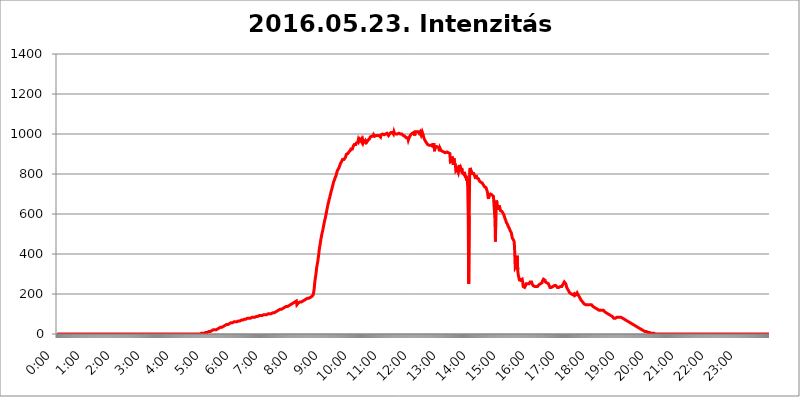
| Category | 2016.05.23. Intenzitás [W/m^2] |
|---|---|
| 0.0 | 0 |
| 0.0006944444444444445 | 0 |
| 0.001388888888888889 | 0 |
| 0.0020833333333333333 | 0 |
| 0.002777777777777778 | 0 |
| 0.003472222222222222 | 0 |
| 0.004166666666666667 | 0 |
| 0.004861111111111111 | 0 |
| 0.005555555555555556 | 0 |
| 0.0062499999999999995 | 0 |
| 0.006944444444444444 | 0 |
| 0.007638888888888889 | 0 |
| 0.008333333333333333 | 0 |
| 0.009027777777777779 | 0 |
| 0.009722222222222222 | 0 |
| 0.010416666666666666 | 0 |
| 0.011111111111111112 | 0 |
| 0.011805555555555555 | 0 |
| 0.012499999999999999 | 0 |
| 0.013194444444444444 | 0 |
| 0.013888888888888888 | 0 |
| 0.014583333333333332 | 0 |
| 0.015277777777777777 | 0 |
| 0.015972222222222224 | 0 |
| 0.016666666666666666 | 0 |
| 0.017361111111111112 | 0 |
| 0.018055555555555557 | 0 |
| 0.01875 | 0 |
| 0.019444444444444445 | 0 |
| 0.02013888888888889 | 0 |
| 0.020833333333333332 | 0 |
| 0.02152777777777778 | 0 |
| 0.022222222222222223 | 0 |
| 0.02291666666666667 | 0 |
| 0.02361111111111111 | 0 |
| 0.024305555555555556 | 0 |
| 0.024999999999999998 | 0 |
| 0.025694444444444447 | 0 |
| 0.02638888888888889 | 0 |
| 0.027083333333333334 | 0 |
| 0.027777777777777776 | 0 |
| 0.02847222222222222 | 0 |
| 0.029166666666666664 | 0 |
| 0.029861111111111113 | 0 |
| 0.030555555555555555 | 0 |
| 0.03125 | 0 |
| 0.03194444444444445 | 0 |
| 0.03263888888888889 | 0 |
| 0.03333333333333333 | 0 |
| 0.034027777777777775 | 0 |
| 0.034722222222222224 | 0 |
| 0.035416666666666666 | 0 |
| 0.036111111111111115 | 0 |
| 0.03680555555555556 | 0 |
| 0.0375 | 0 |
| 0.03819444444444444 | 0 |
| 0.03888888888888889 | 0 |
| 0.03958333333333333 | 0 |
| 0.04027777777777778 | 0 |
| 0.04097222222222222 | 0 |
| 0.041666666666666664 | 0 |
| 0.042361111111111106 | 0 |
| 0.04305555555555556 | 0 |
| 0.043750000000000004 | 0 |
| 0.044444444444444446 | 0 |
| 0.04513888888888889 | 0 |
| 0.04583333333333334 | 0 |
| 0.04652777777777778 | 0 |
| 0.04722222222222222 | 0 |
| 0.04791666666666666 | 0 |
| 0.04861111111111111 | 0 |
| 0.049305555555555554 | 0 |
| 0.049999999999999996 | 0 |
| 0.05069444444444445 | 0 |
| 0.051388888888888894 | 0 |
| 0.052083333333333336 | 0 |
| 0.05277777777777778 | 0 |
| 0.05347222222222222 | 0 |
| 0.05416666666666667 | 0 |
| 0.05486111111111111 | 0 |
| 0.05555555555555555 | 0 |
| 0.05625 | 0 |
| 0.05694444444444444 | 0 |
| 0.057638888888888885 | 0 |
| 0.05833333333333333 | 0 |
| 0.05902777777777778 | 0 |
| 0.059722222222222225 | 0 |
| 0.06041666666666667 | 0 |
| 0.061111111111111116 | 0 |
| 0.06180555555555556 | 0 |
| 0.0625 | 0 |
| 0.06319444444444444 | 0 |
| 0.06388888888888888 | 0 |
| 0.06458333333333334 | 0 |
| 0.06527777777777778 | 0 |
| 0.06597222222222222 | 0 |
| 0.06666666666666667 | 0 |
| 0.06736111111111111 | 0 |
| 0.06805555555555555 | 0 |
| 0.06874999999999999 | 0 |
| 0.06944444444444443 | 0 |
| 0.07013888888888889 | 0 |
| 0.07083333333333333 | 0 |
| 0.07152777777777779 | 0 |
| 0.07222222222222223 | 0 |
| 0.07291666666666667 | 0 |
| 0.07361111111111111 | 0 |
| 0.07430555555555556 | 0 |
| 0.075 | 0 |
| 0.07569444444444444 | 0 |
| 0.0763888888888889 | 0 |
| 0.07708333333333334 | 0 |
| 0.07777777777777778 | 0 |
| 0.07847222222222222 | 0 |
| 0.07916666666666666 | 0 |
| 0.0798611111111111 | 0 |
| 0.08055555555555556 | 0 |
| 0.08125 | 0 |
| 0.08194444444444444 | 0 |
| 0.08263888888888889 | 0 |
| 0.08333333333333333 | 0 |
| 0.08402777777777777 | 0 |
| 0.08472222222222221 | 0 |
| 0.08541666666666665 | 0 |
| 0.08611111111111112 | 0 |
| 0.08680555555555557 | 0 |
| 0.08750000000000001 | 0 |
| 0.08819444444444445 | 0 |
| 0.08888888888888889 | 0 |
| 0.08958333333333333 | 0 |
| 0.09027777777777778 | 0 |
| 0.09097222222222222 | 0 |
| 0.09166666666666667 | 0 |
| 0.09236111111111112 | 0 |
| 0.09305555555555556 | 0 |
| 0.09375 | 0 |
| 0.09444444444444444 | 0 |
| 0.09513888888888888 | 0 |
| 0.09583333333333333 | 0 |
| 0.09652777777777777 | 0 |
| 0.09722222222222222 | 0 |
| 0.09791666666666667 | 0 |
| 0.09861111111111111 | 0 |
| 0.09930555555555555 | 0 |
| 0.09999999999999999 | 0 |
| 0.10069444444444443 | 0 |
| 0.1013888888888889 | 0 |
| 0.10208333333333335 | 0 |
| 0.10277777777777779 | 0 |
| 0.10347222222222223 | 0 |
| 0.10416666666666667 | 0 |
| 0.10486111111111111 | 0 |
| 0.10555555555555556 | 0 |
| 0.10625 | 0 |
| 0.10694444444444444 | 0 |
| 0.1076388888888889 | 0 |
| 0.10833333333333334 | 0 |
| 0.10902777777777778 | 0 |
| 0.10972222222222222 | 0 |
| 0.1111111111111111 | 0 |
| 0.11180555555555556 | 0 |
| 0.11180555555555556 | 0 |
| 0.1125 | 0 |
| 0.11319444444444444 | 0 |
| 0.11388888888888889 | 0 |
| 0.11458333333333333 | 0 |
| 0.11527777777777777 | 0 |
| 0.11597222222222221 | 0 |
| 0.11666666666666665 | 0 |
| 0.1173611111111111 | 0 |
| 0.11805555555555557 | 0 |
| 0.11944444444444445 | 0 |
| 0.12013888888888889 | 0 |
| 0.12083333333333333 | 0 |
| 0.12152777777777778 | 0 |
| 0.12222222222222223 | 0 |
| 0.12291666666666667 | 0 |
| 0.12291666666666667 | 0 |
| 0.12361111111111112 | 0 |
| 0.12430555555555556 | 0 |
| 0.125 | 0 |
| 0.12569444444444444 | 0 |
| 0.12638888888888888 | 0 |
| 0.12708333333333333 | 0 |
| 0.16875 | 0 |
| 0.12847222222222224 | 0 |
| 0.12916666666666668 | 0 |
| 0.12986111111111112 | 0 |
| 0.13055555555555556 | 0 |
| 0.13125 | 0 |
| 0.13194444444444445 | 0 |
| 0.1326388888888889 | 0 |
| 0.13333333333333333 | 0 |
| 0.13402777777777777 | 0 |
| 0.13402777777777777 | 0 |
| 0.13472222222222222 | 0 |
| 0.13541666666666666 | 0 |
| 0.1361111111111111 | 0 |
| 0.13749999999999998 | 0 |
| 0.13819444444444443 | 0 |
| 0.1388888888888889 | 0 |
| 0.13958333333333334 | 0 |
| 0.14027777777777778 | 0 |
| 0.14097222222222222 | 0 |
| 0.14166666666666666 | 0 |
| 0.1423611111111111 | 0 |
| 0.14305555555555557 | 0 |
| 0.14375000000000002 | 0 |
| 0.14444444444444446 | 0 |
| 0.1451388888888889 | 0 |
| 0.1451388888888889 | 0 |
| 0.14652777777777778 | 0 |
| 0.14722222222222223 | 0 |
| 0.14791666666666667 | 0 |
| 0.1486111111111111 | 0 |
| 0.14930555555555555 | 0 |
| 0.15 | 0 |
| 0.15069444444444444 | 0 |
| 0.15138888888888888 | 0 |
| 0.15208333333333332 | 0 |
| 0.15277777777777776 | 0 |
| 0.15347222222222223 | 0 |
| 0.15416666666666667 | 0 |
| 0.15486111111111112 | 0 |
| 0.15555555555555556 | 0 |
| 0.15625 | 0 |
| 0.15694444444444444 | 0 |
| 0.15763888888888888 | 0 |
| 0.15833333333333333 | 0 |
| 0.15902777777777777 | 0 |
| 0.15972222222222224 | 0 |
| 0.16041666666666668 | 0 |
| 0.16111111111111112 | 0 |
| 0.16180555555555556 | 0 |
| 0.1625 | 0 |
| 0.16319444444444445 | 0 |
| 0.1638888888888889 | 0 |
| 0.16458333333333333 | 0 |
| 0.16527777777777777 | 0 |
| 0.16597222222222222 | 0 |
| 0.16666666666666666 | 0 |
| 0.1673611111111111 | 0 |
| 0.16805555555555554 | 0 |
| 0.16874999999999998 | 0 |
| 0.16944444444444443 | 0 |
| 0.17013888888888887 | 0 |
| 0.1708333333333333 | 0 |
| 0.17152777777777775 | 0 |
| 0.17222222222222225 | 0 |
| 0.1729166666666667 | 0 |
| 0.17361111111111113 | 0 |
| 0.17430555555555557 | 0 |
| 0.17500000000000002 | 0 |
| 0.17569444444444446 | 0 |
| 0.1763888888888889 | 0 |
| 0.17708333333333334 | 0 |
| 0.17777777777777778 | 0 |
| 0.17847222222222223 | 0 |
| 0.17916666666666667 | 0 |
| 0.1798611111111111 | 0 |
| 0.18055555555555555 | 0 |
| 0.18125 | 0 |
| 0.18194444444444444 | 0 |
| 0.1826388888888889 | 0 |
| 0.18333333333333335 | 0 |
| 0.1840277777777778 | 0 |
| 0.18472222222222223 | 0 |
| 0.18541666666666667 | 0 |
| 0.18611111111111112 | 0 |
| 0.18680555555555556 | 0 |
| 0.1875 | 0 |
| 0.18819444444444444 | 0 |
| 0.18888888888888888 | 0 |
| 0.18958333333333333 | 0 |
| 0.19027777777777777 | 0 |
| 0.1909722222222222 | 0 |
| 0.19166666666666665 | 0 |
| 0.19236111111111112 | 0 |
| 0.19305555555555554 | 0 |
| 0.19375 | 0 |
| 0.19444444444444445 | 0 |
| 0.1951388888888889 | 0 |
| 0.19583333333333333 | 0 |
| 0.19652777777777777 | 0 |
| 0.19722222222222222 | 0 |
| 0.19791666666666666 | 0 |
| 0.1986111111111111 | 0 |
| 0.19930555555555554 | 0 |
| 0.19999999999999998 | 0 |
| 0.20069444444444443 | 0 |
| 0.20138888888888887 | 3.525 |
| 0.2020833333333333 | 3.525 |
| 0.2027777777777778 | 3.525 |
| 0.2034722222222222 | 3.525 |
| 0.2041666666666667 | 3.525 |
| 0.20486111111111113 | 3.525 |
| 0.20555555555555557 | 3.525 |
| 0.20625000000000002 | 3.525 |
| 0.20694444444444446 | 3.525 |
| 0.2076388888888889 | 3.525 |
| 0.20833333333333334 | 7.887 |
| 0.20902777777777778 | 7.887 |
| 0.20972222222222223 | 7.887 |
| 0.21041666666666667 | 7.887 |
| 0.2111111111111111 | 7.887 |
| 0.21180555555555555 | 12.257 |
| 0.2125 | 12.257 |
| 0.21319444444444444 | 12.257 |
| 0.2138888888888889 | 12.257 |
| 0.21458333333333335 | 12.257 |
| 0.2152777777777778 | 12.257 |
| 0.21597222222222223 | 12.257 |
| 0.21666666666666667 | 16.636 |
| 0.21736111111111112 | 16.636 |
| 0.21805555555555556 | 16.636 |
| 0.21875 | 21.024 |
| 0.21944444444444444 | 21.024 |
| 0.22013888888888888 | 21.024 |
| 0.22083333333333333 | 21.024 |
| 0.22152777777777777 | 21.024 |
| 0.2222222222222222 | 21.024 |
| 0.22291666666666665 | 21.024 |
| 0.2236111111111111 | 21.024 |
| 0.22430555555555556 | 21.024 |
| 0.225 | 25.419 |
| 0.22569444444444445 | 25.419 |
| 0.2263888888888889 | 29.823 |
| 0.22708333333333333 | 29.823 |
| 0.22777777777777777 | 29.823 |
| 0.22847222222222222 | 34.234 |
| 0.22916666666666666 | 34.234 |
| 0.2298611111111111 | 34.234 |
| 0.23055555555555554 | 34.234 |
| 0.23124999999999998 | 34.234 |
| 0.23194444444444443 | 38.653 |
| 0.23263888888888887 | 38.653 |
| 0.2333333333333333 | 38.653 |
| 0.2340277777777778 | 38.653 |
| 0.2347222222222222 | 43.079 |
| 0.2354166666666667 | 43.079 |
| 0.23611111111111113 | 43.079 |
| 0.23680555555555557 | 47.511 |
| 0.23750000000000002 | 47.511 |
| 0.23819444444444446 | 47.511 |
| 0.2388888888888889 | 47.511 |
| 0.23958333333333334 | 47.511 |
| 0.24027777777777778 | 47.511 |
| 0.24097222222222223 | 47.511 |
| 0.24166666666666667 | 51.951 |
| 0.2423611111111111 | 51.951 |
| 0.24305555555555555 | 51.951 |
| 0.24375 | 56.398 |
| 0.24444444444444446 | 56.398 |
| 0.24513888888888888 | 56.398 |
| 0.24583333333333335 | 56.398 |
| 0.2465277777777778 | 56.398 |
| 0.24722222222222223 | 56.398 |
| 0.24791666666666667 | 60.85 |
| 0.24861111111111112 | 60.85 |
| 0.24930555555555556 | 60.85 |
| 0.25 | 60.85 |
| 0.25069444444444444 | 60.85 |
| 0.2513888888888889 | 60.85 |
| 0.2520833333333333 | 60.85 |
| 0.25277777777777777 | 65.31 |
| 0.2534722222222222 | 65.31 |
| 0.25416666666666665 | 65.31 |
| 0.2548611111111111 | 65.31 |
| 0.2555555555555556 | 65.31 |
| 0.25625000000000003 | 65.31 |
| 0.2569444444444445 | 69.775 |
| 0.2576388888888889 | 69.775 |
| 0.25833333333333336 | 69.775 |
| 0.2590277777777778 | 69.775 |
| 0.25972222222222224 | 69.775 |
| 0.2604166666666667 | 69.775 |
| 0.2611111111111111 | 74.246 |
| 0.26180555555555557 | 74.246 |
| 0.2625 | 74.246 |
| 0.26319444444444445 | 74.246 |
| 0.2638888888888889 | 74.246 |
| 0.26458333333333334 | 74.246 |
| 0.2652777777777778 | 74.246 |
| 0.2659722222222222 | 74.246 |
| 0.26666666666666666 | 78.722 |
| 0.2673611111111111 | 78.722 |
| 0.26805555555555555 | 78.722 |
| 0.26875 | 78.722 |
| 0.26944444444444443 | 78.722 |
| 0.2701388888888889 | 78.722 |
| 0.2708333333333333 | 78.722 |
| 0.27152777777777776 | 83.205 |
| 0.2722222222222222 | 83.205 |
| 0.27291666666666664 | 83.205 |
| 0.2736111111111111 | 83.205 |
| 0.2743055555555555 | 83.205 |
| 0.27499999999999997 | 83.205 |
| 0.27569444444444446 | 83.205 |
| 0.27638888888888885 | 83.205 |
| 0.27708333333333335 | 83.205 |
| 0.2777777777777778 | 87.692 |
| 0.27847222222222223 | 87.692 |
| 0.2791666666666667 | 87.692 |
| 0.2798611111111111 | 87.692 |
| 0.28055555555555556 | 87.692 |
| 0.28125 | 87.692 |
| 0.28194444444444444 | 92.184 |
| 0.2826388888888889 | 92.184 |
| 0.2833333333333333 | 92.184 |
| 0.28402777777777777 | 92.184 |
| 0.2847222222222222 | 92.184 |
| 0.28541666666666665 | 92.184 |
| 0.28611111111111115 | 92.184 |
| 0.28680555555555554 | 92.184 |
| 0.28750000000000003 | 92.184 |
| 0.2881944444444445 | 92.184 |
| 0.2888888888888889 | 92.184 |
| 0.28958333333333336 | 96.682 |
| 0.2902777777777778 | 96.682 |
| 0.29097222222222224 | 96.682 |
| 0.2916666666666667 | 96.682 |
| 0.2923611111111111 | 96.682 |
| 0.29305555555555557 | 96.682 |
| 0.29375 | 96.682 |
| 0.29444444444444445 | 96.682 |
| 0.2951388888888889 | 96.682 |
| 0.29583333333333334 | 101.184 |
| 0.2965277777777778 | 101.184 |
| 0.2972222222222222 | 101.184 |
| 0.29791666666666666 | 101.184 |
| 0.2986111111111111 | 101.184 |
| 0.29930555555555555 | 101.184 |
| 0.3 | 101.184 |
| 0.30069444444444443 | 101.184 |
| 0.3013888888888889 | 105.69 |
| 0.3020833333333333 | 105.69 |
| 0.30277777777777776 | 105.69 |
| 0.3034722222222222 | 105.69 |
| 0.30416666666666664 | 105.69 |
| 0.3048611111111111 | 105.69 |
| 0.3055555555555555 | 110.201 |
| 0.30624999999999997 | 110.201 |
| 0.3069444444444444 | 110.201 |
| 0.3076388888888889 | 114.716 |
| 0.30833333333333335 | 114.716 |
| 0.3090277777777778 | 114.716 |
| 0.30972222222222223 | 119.235 |
| 0.3104166666666667 | 119.235 |
| 0.3111111111111111 | 119.235 |
| 0.31180555555555556 | 119.235 |
| 0.3125 | 123.758 |
| 0.31319444444444444 | 123.758 |
| 0.3138888888888889 | 123.758 |
| 0.3145833333333333 | 123.758 |
| 0.31527777777777777 | 128.284 |
| 0.3159722222222222 | 128.284 |
| 0.31666666666666665 | 128.284 |
| 0.31736111111111115 | 128.284 |
| 0.31805555555555554 | 132.814 |
| 0.31875000000000003 | 132.814 |
| 0.3194444444444445 | 132.814 |
| 0.3201388888888889 | 137.347 |
| 0.32083333333333336 | 137.347 |
| 0.3215277777777778 | 137.347 |
| 0.32222222222222224 | 137.347 |
| 0.3229166666666667 | 137.347 |
| 0.3236111111111111 | 137.347 |
| 0.32430555555555557 | 141.884 |
| 0.325 | 141.884 |
| 0.32569444444444445 | 146.423 |
| 0.3263888888888889 | 146.423 |
| 0.32708333333333334 | 146.423 |
| 0.3277777777777778 | 150.964 |
| 0.3284722222222222 | 150.964 |
| 0.32916666666666666 | 150.964 |
| 0.3298611111111111 | 150.964 |
| 0.33055555555555555 | 155.509 |
| 0.33125 | 155.509 |
| 0.33194444444444443 | 155.509 |
| 0.3326388888888889 | 160.056 |
| 0.3333333333333333 | 160.056 |
| 0.3340277777777778 | 160.056 |
| 0.3347222222222222 | 164.605 |
| 0.3354166666666667 | 164.605 |
| 0.3361111111111111 | 146.423 |
| 0.3368055555555556 | 150.964 |
| 0.33749999999999997 | 150.964 |
| 0.33819444444444446 | 155.509 |
| 0.33888888888888885 | 155.509 |
| 0.33958333333333335 | 155.509 |
| 0.34027777777777773 | 160.056 |
| 0.34097222222222223 | 160.056 |
| 0.3416666666666666 | 160.056 |
| 0.3423611111111111 | 160.056 |
| 0.3430555555555555 | 164.605 |
| 0.34375 | 164.605 |
| 0.3444444444444445 | 164.605 |
| 0.3451388888888889 | 164.605 |
| 0.3458333333333334 | 169.156 |
| 0.34652777777777777 | 169.156 |
| 0.34722222222222227 | 173.709 |
| 0.34791666666666665 | 173.709 |
| 0.34861111111111115 | 173.709 |
| 0.34930555555555554 | 173.709 |
| 0.35000000000000003 | 173.709 |
| 0.3506944444444444 | 178.264 |
| 0.3513888888888889 | 178.264 |
| 0.3520833333333333 | 178.264 |
| 0.3527777777777778 | 178.264 |
| 0.3534722222222222 | 182.82 |
| 0.3541666666666667 | 182.82 |
| 0.3548611111111111 | 182.82 |
| 0.35555555555555557 | 182.82 |
| 0.35625 | 187.378 |
| 0.35694444444444445 | 187.378 |
| 0.3576388888888889 | 191.937 |
| 0.35833333333333334 | 191.937 |
| 0.3590277777777778 | 196.497 |
| 0.3597222222222222 | 210.182 |
| 0.36041666666666666 | 228.436 |
| 0.3611111111111111 | 255.813 |
| 0.36180555555555555 | 274.047 |
| 0.3625 | 292.259 |
| 0.36319444444444443 | 310.44 |
| 0.3638888888888889 | 333.113 |
| 0.3645833333333333 | 346.682 |
| 0.3652777777777778 | 360.221 |
| 0.3659722222222222 | 378.224 |
| 0.3666666666666667 | 396.164 |
| 0.3673611111111111 | 418.492 |
| 0.3680555555555556 | 436.27 |
| 0.36874999999999997 | 449.551 |
| 0.36944444444444446 | 467.187 |
| 0.37013888888888885 | 480.356 |
| 0.37083333333333335 | 493.475 |
| 0.37152777777777773 | 506.542 |
| 0.37222222222222223 | 515.223 |
| 0.3729166666666666 | 528.2 |
| 0.3736111111111111 | 541.121 |
| 0.3743055555555555 | 553.986 |
| 0.375 | 566.793 |
| 0.3756944444444445 | 575.299 |
| 0.3763888888888889 | 588.009 |
| 0.3770833333333334 | 600.661 |
| 0.37777777777777777 | 613.252 |
| 0.37847222222222227 | 625.784 |
| 0.37916666666666665 | 638.256 |
| 0.37986111111111115 | 650.667 |
| 0.38055555555555554 | 658.909 |
| 0.38125000000000003 | 671.22 |
| 0.3819444444444444 | 679.395 |
| 0.3826388888888889 | 691.608 |
| 0.3833333333333333 | 699.717 |
| 0.3840277777777778 | 711.832 |
| 0.3847222222222222 | 719.877 |
| 0.3854166666666667 | 727.896 |
| 0.3861111111111111 | 739.877 |
| 0.38680555555555557 | 747.834 |
| 0.3875 | 759.723 |
| 0.38819444444444445 | 763.674 |
| 0.3888888888888889 | 771.559 |
| 0.38958333333333334 | 779.42 |
| 0.3902777777777778 | 783.342 |
| 0.3909722222222222 | 791.169 |
| 0.39166666666666666 | 802.868 |
| 0.3923611111111111 | 810.641 |
| 0.39305555555555555 | 818.392 |
| 0.39375 | 822.26 |
| 0.39444444444444443 | 826.123 |
| 0.3951388888888889 | 829.981 |
| 0.3958333333333333 | 837.682 |
| 0.3965277777777778 | 845.365 |
| 0.3972222222222222 | 853.029 |
| 0.3979166666666667 | 853.029 |
| 0.3986111111111111 | 860.676 |
| 0.3993055555555556 | 864.493 |
| 0.39999999999999997 | 872.114 |
| 0.40069444444444446 | 872.114 |
| 0.40138888888888885 | 872.114 |
| 0.40208333333333335 | 872.114 |
| 0.40277777777777773 | 875.918 |
| 0.40347222222222223 | 875.918 |
| 0.4041666666666666 | 883.516 |
| 0.4048611111111111 | 891.099 |
| 0.4055555555555555 | 898.668 |
| 0.40625 | 894.885 |
| 0.4069444444444445 | 902.447 |
| 0.4076388888888889 | 902.447 |
| 0.4083333333333334 | 906.223 |
| 0.40902777777777777 | 909.996 |
| 0.40972222222222227 | 909.996 |
| 0.41041666666666665 | 913.766 |
| 0.41111111111111115 | 917.534 |
| 0.41180555555555554 | 925.06 |
| 0.41250000000000003 | 928.819 |
| 0.4131944444444444 | 925.06 |
| 0.4138888888888889 | 925.06 |
| 0.4145833333333333 | 932.576 |
| 0.4152777777777778 | 940.082 |
| 0.4159722222222222 | 943.832 |
| 0.4166666666666667 | 947.58 |
| 0.4173611111111111 | 943.832 |
| 0.41805555555555557 | 947.58 |
| 0.41875 | 947.58 |
| 0.41944444444444445 | 955.071 |
| 0.4201388888888889 | 955.071 |
| 0.42083333333333334 | 958.814 |
| 0.4215277777777778 | 958.814 |
| 0.4222222222222222 | 970.034 |
| 0.42291666666666666 | 962.555 |
| 0.4236111111111111 | 966.295 |
| 0.42430555555555555 | 973.772 |
| 0.425 | 970.034 |
| 0.42569444444444443 | 970.034 |
| 0.4263888888888889 | 962.555 |
| 0.4270833333333333 | 970.034 |
| 0.4277777777777778 | 962.555 |
| 0.4284722222222222 | 970.034 |
| 0.4291666666666667 | 958.814 |
| 0.4298611111111111 | 966.295 |
| 0.4305555555555556 | 970.034 |
| 0.43124999999999997 | 962.555 |
| 0.43194444444444446 | 958.814 |
| 0.43263888888888885 | 966.295 |
| 0.43333333333333335 | 966.295 |
| 0.43402777777777773 | 958.814 |
| 0.43472222222222223 | 958.814 |
| 0.4354166666666666 | 958.814 |
| 0.4361111111111111 | 970.034 |
| 0.4368055555555555 | 970.034 |
| 0.4375 | 970.034 |
| 0.4381944444444445 | 977.508 |
| 0.4388888888888889 | 984.98 |
| 0.4395833333333334 | 984.98 |
| 0.44027777777777777 | 984.98 |
| 0.44097222222222227 | 988.714 |
| 0.44166666666666665 | 992.448 |
| 0.44236111111111115 | 984.98 |
| 0.44305555555555554 | 988.714 |
| 0.44375000000000003 | 996.182 |
| 0.4444444444444444 | 992.448 |
| 0.4451388888888889 | 988.714 |
| 0.4458333333333333 | 992.448 |
| 0.4465277777777778 | 992.448 |
| 0.4472222222222222 | 992.448 |
| 0.4479166666666667 | 988.714 |
| 0.4486111111111111 | 992.448 |
| 0.44930555555555557 | 992.448 |
| 0.45 | 988.714 |
| 0.45069444444444445 | 992.448 |
| 0.4513888888888889 | 992.448 |
| 0.45208333333333334 | 992.448 |
| 0.4527777777777778 | 988.714 |
| 0.4534722222222222 | 984.98 |
| 0.45416666666666666 | 996.182 |
| 0.4548611111111111 | 999.916 |
| 0.45555555555555555 | 996.182 |
| 0.45625 | 999.916 |
| 0.45694444444444443 | 996.182 |
| 0.4576388888888889 | 999.916 |
| 0.4583333333333333 | 996.182 |
| 0.4590277777777778 | 999.916 |
| 0.4597222222222222 | 992.448 |
| 0.4604166666666667 | 999.916 |
| 0.4611111111111111 | 999.916 |
| 0.4618055555555556 | 1003.65 |
| 0.46249999999999997 | 1003.65 |
| 0.46319444444444446 | 999.916 |
| 0.46388888888888885 | 1003.65 |
| 0.46458333333333335 | 992.448 |
| 0.46527777777777773 | 996.182 |
| 0.46597222222222223 | 999.916 |
| 0.4666666666666666 | 996.182 |
| 0.4673611111111111 | 999.916 |
| 0.4680555555555555 | 1007.383 |
| 0.46875 | 1007.383 |
| 0.4694444444444445 | 1007.383 |
| 0.4701388888888889 | 1007.383 |
| 0.4708333333333334 | 1003.65 |
| 0.47152777777777777 | 999.916 |
| 0.47222222222222227 | 1011.118 |
| 0.47291666666666665 | 1003.65 |
| 0.47361111111111115 | 1007.383 |
| 0.47430555555555554 | 1007.383 |
| 0.47500000000000003 | 999.916 |
| 0.4756944444444444 | 999.916 |
| 0.4763888888888889 | 1003.65 |
| 0.4770833333333333 | 999.916 |
| 0.4777777777777778 | 999.916 |
| 0.4784722222222222 | 999.916 |
| 0.4791666666666667 | 1003.65 |
| 0.4798611111111111 | 999.916 |
| 0.48055555555555557 | 1007.383 |
| 0.48125 | 999.916 |
| 0.48194444444444445 | 1003.65 |
| 0.4826388888888889 | 1003.65 |
| 0.48333333333333334 | 999.916 |
| 0.4840277777777778 | 999.916 |
| 0.4847222222222222 | 999.916 |
| 0.48541666666666666 | 992.448 |
| 0.4861111111111111 | 996.182 |
| 0.48680555555555555 | 988.714 |
| 0.4875 | 988.714 |
| 0.48819444444444443 | 984.98 |
| 0.4888888888888889 | 984.98 |
| 0.4895833333333333 | 981.244 |
| 0.4902777777777778 | 977.508 |
| 0.4909722222222222 | 984.98 |
| 0.4916666666666667 | 981.244 |
| 0.4923611111111111 | 970.034 |
| 0.4930555555555556 | 977.508 |
| 0.49374999999999997 | 973.772 |
| 0.49444444444444446 | 988.714 |
| 0.49513888888888885 | 992.448 |
| 0.49583333333333335 | 996.182 |
| 0.49652777777777773 | 996.182 |
| 0.49722222222222223 | 992.448 |
| 0.4979166666666666 | 1003.65 |
| 0.4986111111111111 | 999.916 |
| 0.4993055555555555 | 1003.65 |
| 0.5 | 1007.383 |
| 0.5006944444444444 | 1011.118 |
| 0.5013888888888889 | 992.448 |
| 0.5020833333333333 | 1011.118 |
| 0.5027777777777778 | 1011.118 |
| 0.5034722222222222 | 1011.118 |
| 0.5041666666666667 | 1011.118 |
| 0.5048611111111111 | 1007.383 |
| 0.5055555555555555 | 1011.118 |
| 0.50625 | 1011.118 |
| 0.5069444444444444 | 1007.383 |
| 0.5076388888888889 | 1003.65 |
| 0.5083333333333333 | 1007.383 |
| 0.5090277777777777 | 1011.118 |
| 0.5097222222222222 | 1007.383 |
| 0.5104166666666666 | 996.182 |
| 0.5111111111111112 | 996.182 |
| 0.5118055555555555 | 1011.118 |
| 0.5125000000000001 | 1003.65 |
| 0.5131944444444444 | 996.182 |
| 0.513888888888889 | 984.98 |
| 0.5145833333333333 | 977.508 |
| 0.5152777777777778 | 973.772 |
| 0.5159722222222222 | 966.295 |
| 0.5166666666666667 | 962.555 |
| 0.517361111111111 | 962.555 |
| 0.5180555555555556 | 955.071 |
| 0.5187499999999999 | 951.327 |
| 0.5194444444444445 | 947.58 |
| 0.5201388888888888 | 947.58 |
| 0.5208333333333334 | 947.58 |
| 0.5215277777777778 | 943.832 |
| 0.5222222222222223 | 943.832 |
| 0.5229166666666667 | 943.832 |
| 0.5236111111111111 | 943.832 |
| 0.5243055555555556 | 940.082 |
| 0.525 | 940.082 |
| 0.5256944444444445 | 940.082 |
| 0.5263888888888889 | 947.58 |
| 0.5270833333333333 | 951.327 |
| 0.5277777777777778 | 951.327 |
| 0.5284722222222222 | 947.58 |
| 0.5291666666666667 | 913.766 |
| 0.5298611111111111 | 943.832 |
| 0.5305555555555556 | 932.576 |
| 0.53125 | 932.576 |
| 0.5319444444444444 | 932.576 |
| 0.5326388888888889 | 936.33 |
| 0.5333333333333333 | 932.576 |
| 0.5340277777777778 | 932.576 |
| 0.5347222222222222 | 932.576 |
| 0.5354166666666667 | 925.06 |
| 0.5361111111111111 | 913.766 |
| 0.5368055555555555 | 928.819 |
| 0.5375 | 925.06 |
| 0.5381944444444444 | 917.534 |
| 0.5388888888888889 | 921.298 |
| 0.5395833333333333 | 917.534 |
| 0.5402777777777777 | 913.766 |
| 0.5409722222222222 | 913.766 |
| 0.5416666666666666 | 913.766 |
| 0.5423611111111112 | 909.996 |
| 0.5430555555555555 | 909.996 |
| 0.5437500000000001 | 906.223 |
| 0.5444444444444444 | 906.223 |
| 0.545138888888889 | 906.223 |
| 0.5458333333333333 | 909.996 |
| 0.5465277777777778 | 909.996 |
| 0.5472222222222222 | 909.996 |
| 0.5479166666666667 | 906.223 |
| 0.548611111111111 | 906.223 |
| 0.5493055555555556 | 906.223 |
| 0.5499999999999999 | 906.223 |
| 0.5506944444444445 | 902.447 |
| 0.5513888888888888 | 860.676 |
| 0.5520833333333334 | 856.855 |
| 0.5527777777777778 | 860.676 |
| 0.5534722222222223 | 864.493 |
| 0.5541666666666667 | 887.309 |
| 0.5548611111111111 | 887.309 |
| 0.5555555555555556 | 845.365 |
| 0.55625 | 879.719 |
| 0.5569444444444445 | 856.855 |
| 0.5576388888888889 | 856.855 |
| 0.5583333333333333 | 849.199 |
| 0.5590277777777778 | 818.392 |
| 0.5597222222222222 | 814.519 |
| 0.5604166666666667 | 826.123 |
| 0.5611111111111111 | 822.26 |
| 0.5618055555555556 | 829.981 |
| 0.5625 | 806.757 |
| 0.5631944444444444 | 822.26 |
| 0.5638888888888889 | 845.365 |
| 0.5645833333333333 | 837.682 |
| 0.5652777777777778 | 822.26 |
| 0.5659722222222222 | 829.981 |
| 0.5666666666666667 | 822.26 |
| 0.5673611111111111 | 829.981 |
| 0.5680555555555555 | 806.757 |
| 0.56875 | 802.868 |
| 0.5694444444444444 | 802.868 |
| 0.5701388888888889 | 798.974 |
| 0.5708333333333333 | 810.641 |
| 0.5715277777777777 | 798.974 |
| 0.5722222222222222 | 795.074 |
| 0.5729166666666666 | 779.42 |
| 0.5736111111111112 | 791.169 |
| 0.5743055555555555 | 767.62 |
| 0.5750000000000001 | 775.492 |
| 0.5756944444444444 | 743.859 |
| 0.576388888888889 | 596.45 |
| 0.5770833333333333 | 251.251 |
| 0.5777777777777778 | 592.233 |
| 0.5784722222222222 | 818.392 |
| 0.5791666666666667 | 829.981 |
| 0.579861111111111 | 822.26 |
| 0.5805555555555556 | 822.26 |
| 0.5812499999999999 | 810.641 |
| 0.5819444444444445 | 802.868 |
| 0.5826388888888888 | 802.868 |
| 0.5833333333333334 | 806.757 |
| 0.5840277777777778 | 802.868 |
| 0.5847222222222223 | 798.974 |
| 0.5854166666666667 | 791.169 |
| 0.5861111111111111 | 783.342 |
| 0.5868055555555556 | 783.342 |
| 0.5875 | 783.342 |
| 0.5881944444444445 | 787.258 |
| 0.5888888888888889 | 779.42 |
| 0.5895833333333333 | 779.42 |
| 0.5902777777777778 | 779.42 |
| 0.5909722222222222 | 775.492 |
| 0.5916666666666667 | 767.62 |
| 0.5923611111111111 | 767.62 |
| 0.5930555555555556 | 763.674 |
| 0.59375 | 759.723 |
| 0.5944444444444444 | 759.723 |
| 0.5951388888888889 | 755.766 |
| 0.5958333333333333 | 755.766 |
| 0.5965277777777778 | 751.803 |
| 0.5972222222222222 | 751.803 |
| 0.5979166666666667 | 743.859 |
| 0.5986111111111111 | 739.877 |
| 0.5993055555555555 | 735.89 |
| 0.6 | 735.89 |
| 0.6006944444444444 | 735.89 |
| 0.6013888888888889 | 731.896 |
| 0.6020833333333333 | 723.889 |
| 0.6027777777777777 | 715.858 |
| 0.6034722222222222 | 707.8 |
| 0.6041666666666666 | 687.544 |
| 0.6048611111111112 | 675.311 |
| 0.6055555555555555 | 691.608 |
| 0.6062500000000001 | 695.666 |
| 0.6069444444444444 | 695.666 |
| 0.607638888888889 | 699.717 |
| 0.6083333333333333 | 699.717 |
| 0.6090277777777778 | 699.717 |
| 0.6097222222222222 | 695.666 |
| 0.6104166666666667 | 691.608 |
| 0.611111111111111 | 691.608 |
| 0.6118055555555556 | 687.544 |
| 0.6124999999999999 | 687.544 |
| 0.6131944444444445 | 683.473 |
| 0.6138888888888888 | 575.299 |
| 0.6145833333333334 | 462.786 |
| 0.6152777777777778 | 650.667 |
| 0.6159722222222223 | 667.123 |
| 0.6166666666666667 | 658.909 |
| 0.6173611111111111 | 642.4 |
| 0.6180555555555556 | 642.4 |
| 0.61875 | 621.613 |
| 0.6194444444444445 | 642.4 |
| 0.6201388888888889 | 642.4 |
| 0.6208333333333333 | 629.948 |
| 0.6215277777777778 | 617.436 |
| 0.6222222222222222 | 617.436 |
| 0.6229166666666667 | 617.436 |
| 0.6236111111111111 | 613.252 |
| 0.6243055555555556 | 609.062 |
| 0.625 | 604.864 |
| 0.6256944444444444 | 600.661 |
| 0.6263888888888889 | 596.45 |
| 0.6270833333333333 | 588.009 |
| 0.6277777777777778 | 579.542 |
| 0.6284722222222222 | 575.299 |
| 0.6291666666666667 | 566.793 |
| 0.6298611111111111 | 558.261 |
| 0.6305555555555555 | 553.986 |
| 0.63125 | 549.704 |
| 0.6319444444444444 | 545.416 |
| 0.6326388888888889 | 536.82 |
| 0.6333333333333333 | 532.513 |
| 0.6340277777777777 | 528.2 |
| 0.6347222222222222 | 523.88 |
| 0.6354166666666666 | 515.223 |
| 0.6361111111111112 | 510.885 |
| 0.6368055555555555 | 506.542 |
| 0.6375000000000001 | 502.192 |
| 0.6381944444444444 | 480.356 |
| 0.638888888888889 | 480.356 |
| 0.6395833333333333 | 480.356 |
| 0.6402777777777778 | 467.187 |
| 0.6409722222222222 | 458.38 |
| 0.6416666666666667 | 405.108 |
| 0.642361111111111 | 333.113 |
| 0.6430555555555556 | 337.639 |
| 0.6437499999999999 | 342.162 |
| 0.6444444444444445 | 364.728 |
| 0.6451388888888888 | 391.685 |
| 0.6458333333333334 | 319.517 |
| 0.6465277777777778 | 296.808 |
| 0.6472222222222223 | 292.259 |
| 0.6479166666666667 | 274.047 |
| 0.6486111111111111 | 264.932 |
| 0.6493055555555556 | 278.603 |
| 0.65 | 269.49 |
| 0.6506944444444445 | 264.932 |
| 0.6513888888888889 | 264.932 |
| 0.6520833333333333 | 274.047 |
| 0.6527777777777778 | 260.373 |
| 0.6534722222222222 | 237.564 |
| 0.6541666666666667 | 233 |
| 0.6548611111111111 | 233 |
| 0.6555555555555556 | 233 |
| 0.65625 | 237.564 |
| 0.6569444444444444 | 242.127 |
| 0.6576388888888889 | 251.251 |
| 0.6583333333333333 | 255.813 |
| 0.6590277777777778 | 255.813 |
| 0.6597222222222222 | 251.251 |
| 0.6604166666666667 | 246.689 |
| 0.6611111111111111 | 251.251 |
| 0.6618055555555555 | 251.251 |
| 0.6625 | 255.813 |
| 0.6631944444444444 | 260.373 |
| 0.6638888888888889 | 260.373 |
| 0.6645833333333333 | 260.373 |
| 0.6652777777777777 | 260.373 |
| 0.6659722222222222 | 251.251 |
| 0.6666666666666666 | 246.689 |
| 0.6673611111111111 | 242.127 |
| 0.6680555555555556 | 242.127 |
| 0.6687500000000001 | 237.564 |
| 0.6694444444444444 | 237.564 |
| 0.6701388888888888 | 237.564 |
| 0.6708333333333334 | 237.564 |
| 0.6715277777777778 | 237.564 |
| 0.6722222222222222 | 233 |
| 0.6729166666666666 | 233 |
| 0.6736111111111112 | 237.564 |
| 0.6743055555555556 | 237.564 |
| 0.6749999999999999 | 242.127 |
| 0.6756944444444444 | 246.689 |
| 0.6763888888888889 | 246.689 |
| 0.6770833333333334 | 246.689 |
| 0.6777777777777777 | 251.251 |
| 0.6784722222222223 | 251.251 |
| 0.6791666666666667 | 255.813 |
| 0.6798611111111111 | 255.813 |
| 0.6805555555555555 | 264.932 |
| 0.68125 | 269.49 |
| 0.6819444444444445 | 274.047 |
| 0.6826388888888889 | 269.49 |
| 0.6833333333333332 | 278.603 |
| 0.6840277777777778 | 269.49 |
| 0.6847222222222222 | 260.373 |
| 0.6854166666666667 | 255.813 |
| 0.686111111111111 | 255.813 |
| 0.6868055555555556 | 255.813 |
| 0.6875 | 255.813 |
| 0.6881944444444444 | 251.251 |
| 0.688888888888889 | 251.251 |
| 0.6895833333333333 | 251.251 |
| 0.6902777777777778 | 246.689 |
| 0.6909722222222222 | 233 |
| 0.6916666666666668 | 233 |
| 0.6923611111111111 | 233 |
| 0.6930555555555555 | 233 |
| 0.69375 | 237.564 |
| 0.6944444444444445 | 233 |
| 0.6951388888888889 | 237.564 |
| 0.6958333333333333 | 242.127 |
| 0.6965277777777777 | 242.127 |
| 0.6972222222222223 | 242.127 |
| 0.6979166666666666 | 242.127 |
| 0.6986111111111111 | 242.127 |
| 0.6993055555555556 | 242.127 |
| 0.7000000000000001 | 242.127 |
| 0.7006944444444444 | 237.564 |
| 0.7013888888888888 | 233 |
| 0.7020833333333334 | 233 |
| 0.7027777777777778 | 228.436 |
| 0.7034722222222222 | 233 |
| 0.7041666666666666 | 233 |
| 0.7048611111111112 | 228.436 |
| 0.7055555555555556 | 237.564 |
| 0.7062499999999999 | 233 |
| 0.7069444444444444 | 237.564 |
| 0.7076388888888889 | 237.564 |
| 0.7083333333333334 | 237.564 |
| 0.7090277777777777 | 237.564 |
| 0.7097222222222223 | 251.251 |
| 0.7104166666666667 | 251.251 |
| 0.7111111111111111 | 260.373 |
| 0.7118055555555555 | 264.932 |
| 0.7125 | 255.813 |
| 0.7131944444444445 | 251.251 |
| 0.7138888888888889 | 242.127 |
| 0.7145833333333332 | 233 |
| 0.7152777777777778 | 228.436 |
| 0.7159722222222222 | 223.873 |
| 0.7166666666666667 | 219.309 |
| 0.717361111111111 | 214.746 |
| 0.7180555555555556 | 210.182 |
| 0.71875 | 205.62 |
| 0.7194444444444444 | 201.058 |
| 0.720138888888889 | 201.058 |
| 0.7208333333333333 | 201.058 |
| 0.7215277777777778 | 201.058 |
| 0.7222222222222222 | 196.497 |
| 0.7229166666666668 | 196.497 |
| 0.7236111111111111 | 196.497 |
| 0.7243055555555555 | 201.058 |
| 0.725 | 201.058 |
| 0.7256944444444445 | 191.937 |
| 0.7263888888888889 | 191.937 |
| 0.7270833333333333 | 191.937 |
| 0.7277777777777777 | 196.497 |
| 0.7284722222222223 | 201.058 |
| 0.7291666666666666 | 205.62 |
| 0.7298611111111111 | 201.058 |
| 0.7305555555555556 | 196.497 |
| 0.7312500000000001 | 191.937 |
| 0.7319444444444444 | 187.378 |
| 0.7326388888888888 | 182.82 |
| 0.7333333333333334 | 178.264 |
| 0.7340277777777778 | 173.709 |
| 0.7347222222222222 | 169.156 |
| 0.7354166666666666 | 164.605 |
| 0.7361111111111112 | 164.605 |
| 0.7368055555555556 | 160.056 |
| 0.7374999999999999 | 155.509 |
| 0.7381944444444444 | 155.509 |
| 0.7388888888888889 | 150.964 |
| 0.7395833333333334 | 150.964 |
| 0.7402777777777777 | 146.423 |
| 0.7409722222222223 | 146.423 |
| 0.7416666666666667 | 146.423 |
| 0.7423611111111111 | 146.423 |
| 0.7430555555555555 | 146.423 |
| 0.74375 | 146.423 |
| 0.7444444444444445 | 146.423 |
| 0.7451388888888889 | 146.423 |
| 0.7458333333333332 | 146.423 |
| 0.7465277777777778 | 146.423 |
| 0.7472222222222222 | 146.423 |
| 0.7479166666666667 | 146.423 |
| 0.748611111111111 | 146.423 |
| 0.7493055555555556 | 146.423 |
| 0.75 | 141.884 |
| 0.7506944444444444 | 141.884 |
| 0.751388888888889 | 137.347 |
| 0.7520833333333333 | 137.347 |
| 0.7527777777777778 | 132.814 |
| 0.7534722222222222 | 132.814 |
| 0.7541666666666668 | 128.284 |
| 0.7548611111111111 | 128.284 |
| 0.7555555555555555 | 128.284 |
| 0.75625 | 123.758 |
| 0.7569444444444445 | 123.758 |
| 0.7576388888888889 | 123.758 |
| 0.7583333333333333 | 123.758 |
| 0.7590277777777777 | 119.235 |
| 0.7597222222222223 | 119.235 |
| 0.7604166666666666 | 119.235 |
| 0.7611111111111111 | 119.235 |
| 0.7618055555555556 | 119.235 |
| 0.7625000000000001 | 119.235 |
| 0.7631944444444444 | 119.235 |
| 0.7638888888888888 | 119.235 |
| 0.7645833333333334 | 119.235 |
| 0.7652777777777778 | 119.235 |
| 0.7659722222222222 | 119.235 |
| 0.7666666666666666 | 114.716 |
| 0.7673611111111112 | 114.716 |
| 0.7680555555555556 | 110.201 |
| 0.7687499999999999 | 110.201 |
| 0.7694444444444444 | 110.201 |
| 0.7701388888888889 | 105.69 |
| 0.7708333333333334 | 105.69 |
| 0.7715277777777777 | 101.184 |
| 0.7722222222222223 | 101.184 |
| 0.7729166666666667 | 101.184 |
| 0.7736111111111111 | 96.682 |
| 0.7743055555555555 | 96.682 |
| 0.775 | 96.682 |
| 0.7756944444444445 | 92.184 |
| 0.7763888888888889 | 92.184 |
| 0.7770833333333332 | 92.184 |
| 0.7777777777777778 | 87.692 |
| 0.7784722222222222 | 87.692 |
| 0.7791666666666667 | 83.205 |
| 0.779861111111111 | 83.205 |
| 0.7805555555555556 | 78.722 |
| 0.78125 | 78.722 |
| 0.7819444444444444 | 78.722 |
| 0.782638888888889 | 78.722 |
| 0.7833333333333333 | 78.722 |
| 0.7840277777777778 | 83.205 |
| 0.7847222222222222 | 83.205 |
| 0.7854166666666668 | 83.205 |
| 0.7861111111111111 | 87.692 |
| 0.7868055555555555 | 83.205 |
| 0.7875 | 83.205 |
| 0.7881944444444445 | 83.205 |
| 0.7888888888888889 | 83.205 |
| 0.7895833333333333 | 83.205 |
| 0.7902777777777777 | 83.205 |
| 0.7909722222222223 | 83.205 |
| 0.7916666666666666 | 83.205 |
| 0.7923611111111111 | 78.722 |
| 0.7930555555555556 | 78.722 |
| 0.7937500000000001 | 78.722 |
| 0.7944444444444444 | 78.722 |
| 0.7951388888888888 | 74.246 |
| 0.7958333333333334 | 74.246 |
| 0.7965277777777778 | 74.246 |
| 0.7972222222222222 | 69.775 |
| 0.7979166666666666 | 69.775 |
| 0.7986111111111112 | 65.31 |
| 0.7993055555555556 | 65.31 |
| 0.7999999999999999 | 65.31 |
| 0.8006944444444444 | 65.31 |
| 0.8013888888888889 | 60.85 |
| 0.8020833333333334 | 60.85 |
| 0.8027777777777777 | 60.85 |
| 0.8034722222222223 | 56.398 |
| 0.8041666666666667 | 56.398 |
| 0.8048611111111111 | 56.398 |
| 0.8055555555555555 | 51.951 |
| 0.80625 | 51.951 |
| 0.8069444444444445 | 47.511 |
| 0.8076388888888889 | 47.511 |
| 0.8083333333333332 | 47.511 |
| 0.8090277777777778 | 47.511 |
| 0.8097222222222222 | 43.079 |
| 0.8104166666666667 | 43.079 |
| 0.811111111111111 | 43.079 |
| 0.8118055555555556 | 38.653 |
| 0.8125 | 38.653 |
| 0.8131944444444444 | 38.653 |
| 0.813888888888889 | 34.234 |
| 0.8145833333333333 | 34.234 |
| 0.8152777777777778 | 29.823 |
| 0.8159722222222222 | 29.823 |
| 0.8166666666666668 | 29.823 |
| 0.8173611111111111 | 25.419 |
| 0.8180555555555555 | 25.419 |
| 0.81875 | 25.419 |
| 0.8194444444444445 | 21.024 |
| 0.8201388888888889 | 21.024 |
| 0.8208333333333333 | 21.024 |
| 0.8215277777777777 | 16.636 |
| 0.8222222222222223 | 16.636 |
| 0.8229166666666666 | 16.636 |
| 0.8236111111111111 | 12.257 |
| 0.8243055555555556 | 12.257 |
| 0.8250000000000001 | 12.257 |
| 0.8256944444444444 | 12.257 |
| 0.8263888888888888 | 12.257 |
| 0.8270833333333334 | 12.257 |
| 0.8277777777777778 | 7.887 |
| 0.8284722222222222 | 7.887 |
| 0.8291666666666666 | 7.887 |
| 0.8298611111111112 | 7.887 |
| 0.8305555555555556 | 7.887 |
| 0.8312499999999999 | 3.525 |
| 0.8319444444444444 | 3.525 |
| 0.8326388888888889 | 3.525 |
| 0.8333333333333334 | 3.525 |
| 0.8340277777777777 | 3.525 |
| 0.8347222222222223 | 3.525 |
| 0.8354166666666667 | 3.525 |
| 0.8361111111111111 | 3.525 |
| 0.8368055555555555 | 3.525 |
| 0.8375 | 3.525 |
| 0.8381944444444445 | 3.525 |
| 0.8388888888888889 | 0 |
| 0.8395833333333332 | 0 |
| 0.8402777777777778 | 0 |
| 0.8409722222222222 | 0 |
| 0.8416666666666667 | 0 |
| 0.842361111111111 | 0 |
| 0.8430555555555556 | 0 |
| 0.84375 | 0 |
| 0.8444444444444444 | 0 |
| 0.845138888888889 | 0 |
| 0.8458333333333333 | 0 |
| 0.8465277777777778 | 0 |
| 0.8472222222222222 | 0 |
| 0.8479166666666668 | 0 |
| 0.8486111111111111 | 0 |
| 0.8493055555555555 | 0 |
| 0.85 | 0 |
| 0.8506944444444445 | 0 |
| 0.8513888888888889 | 0 |
| 0.8520833333333333 | 0 |
| 0.8527777777777777 | 0 |
| 0.8534722222222223 | 0 |
| 0.8541666666666666 | 0 |
| 0.8548611111111111 | 0 |
| 0.8555555555555556 | 0 |
| 0.8562500000000001 | 0 |
| 0.8569444444444444 | 0 |
| 0.8576388888888888 | 0 |
| 0.8583333333333334 | 0 |
| 0.8590277777777778 | 0 |
| 0.8597222222222222 | 0 |
| 0.8604166666666666 | 0 |
| 0.8611111111111112 | 0 |
| 0.8618055555555556 | 0 |
| 0.8624999999999999 | 0 |
| 0.8631944444444444 | 0 |
| 0.8638888888888889 | 0 |
| 0.8645833333333334 | 0 |
| 0.8652777777777777 | 0 |
| 0.8659722222222223 | 0 |
| 0.8666666666666667 | 0 |
| 0.8673611111111111 | 0 |
| 0.8680555555555555 | 0 |
| 0.86875 | 0 |
| 0.8694444444444445 | 0 |
| 0.8701388888888889 | 0 |
| 0.8708333333333332 | 0 |
| 0.8715277777777778 | 0 |
| 0.8722222222222222 | 0 |
| 0.8729166666666667 | 0 |
| 0.873611111111111 | 0 |
| 0.8743055555555556 | 0 |
| 0.875 | 0 |
| 0.8756944444444444 | 0 |
| 0.876388888888889 | 0 |
| 0.8770833333333333 | 0 |
| 0.8777777777777778 | 0 |
| 0.8784722222222222 | 0 |
| 0.8791666666666668 | 0 |
| 0.8798611111111111 | 0 |
| 0.8805555555555555 | 0 |
| 0.88125 | 0 |
| 0.8819444444444445 | 0 |
| 0.8826388888888889 | 0 |
| 0.8833333333333333 | 0 |
| 0.8840277777777777 | 0 |
| 0.8847222222222223 | 0 |
| 0.8854166666666666 | 0 |
| 0.8861111111111111 | 0 |
| 0.8868055555555556 | 0 |
| 0.8875000000000001 | 0 |
| 0.8881944444444444 | 0 |
| 0.8888888888888888 | 0 |
| 0.8895833333333334 | 0 |
| 0.8902777777777778 | 0 |
| 0.8909722222222222 | 0 |
| 0.8916666666666666 | 0 |
| 0.8923611111111112 | 0 |
| 0.8930555555555556 | 0 |
| 0.8937499999999999 | 0 |
| 0.8944444444444444 | 0 |
| 0.8951388888888889 | 0 |
| 0.8958333333333334 | 0 |
| 0.8965277777777777 | 0 |
| 0.8972222222222223 | 0 |
| 0.8979166666666667 | 0 |
| 0.8986111111111111 | 0 |
| 0.8993055555555555 | 0 |
| 0.9 | 0 |
| 0.9006944444444445 | 0 |
| 0.9013888888888889 | 0 |
| 0.9020833333333332 | 0 |
| 0.9027777777777778 | 0 |
| 0.9034722222222222 | 0 |
| 0.9041666666666667 | 0 |
| 0.904861111111111 | 0 |
| 0.9055555555555556 | 0 |
| 0.90625 | 0 |
| 0.9069444444444444 | 0 |
| 0.907638888888889 | 0 |
| 0.9083333333333333 | 0 |
| 0.9090277777777778 | 0 |
| 0.9097222222222222 | 0 |
| 0.9104166666666668 | 0 |
| 0.9111111111111111 | 0 |
| 0.9118055555555555 | 0 |
| 0.9125 | 0 |
| 0.9131944444444445 | 0 |
| 0.9138888888888889 | 0 |
| 0.9145833333333333 | 0 |
| 0.9152777777777777 | 0 |
| 0.9159722222222223 | 0 |
| 0.9166666666666666 | 0 |
| 0.9173611111111111 | 0 |
| 0.9180555555555556 | 0 |
| 0.9187500000000001 | 0 |
| 0.9194444444444444 | 0 |
| 0.9201388888888888 | 0 |
| 0.9208333333333334 | 0 |
| 0.9215277777777778 | 0 |
| 0.9222222222222222 | 0 |
| 0.9229166666666666 | 0 |
| 0.9236111111111112 | 0 |
| 0.9243055555555556 | 0 |
| 0.9249999999999999 | 0 |
| 0.9256944444444444 | 0 |
| 0.9263888888888889 | 0 |
| 0.9270833333333334 | 0 |
| 0.9277777777777777 | 0 |
| 0.9284722222222223 | 0 |
| 0.9291666666666667 | 0 |
| 0.9298611111111111 | 0 |
| 0.9305555555555555 | 0 |
| 0.93125 | 0 |
| 0.9319444444444445 | 0 |
| 0.9326388888888889 | 0 |
| 0.9333333333333332 | 0 |
| 0.9340277777777778 | 0 |
| 0.9347222222222222 | 0 |
| 0.9354166666666667 | 0 |
| 0.936111111111111 | 0 |
| 0.9368055555555556 | 0 |
| 0.9375 | 0 |
| 0.9381944444444444 | 0 |
| 0.938888888888889 | 0 |
| 0.9395833333333333 | 0 |
| 0.9402777777777778 | 0 |
| 0.9409722222222222 | 0 |
| 0.9416666666666668 | 0 |
| 0.9423611111111111 | 0 |
| 0.9430555555555555 | 0 |
| 0.94375 | 0 |
| 0.9444444444444445 | 0 |
| 0.9451388888888889 | 0 |
| 0.9458333333333333 | 0 |
| 0.9465277777777777 | 0 |
| 0.9472222222222223 | 0 |
| 0.9479166666666666 | 0 |
| 0.9486111111111111 | 0 |
| 0.9493055555555556 | 0 |
| 0.9500000000000001 | 0 |
| 0.9506944444444444 | 0 |
| 0.9513888888888888 | 0 |
| 0.9520833333333334 | 0 |
| 0.9527777777777778 | 0 |
| 0.9534722222222222 | 0 |
| 0.9541666666666666 | 0 |
| 0.9548611111111112 | 0 |
| 0.9555555555555556 | 0 |
| 0.9562499999999999 | 0 |
| 0.9569444444444444 | 0 |
| 0.9576388888888889 | 0 |
| 0.9583333333333334 | 0 |
| 0.9590277777777777 | 0 |
| 0.9597222222222223 | 0 |
| 0.9604166666666667 | 0 |
| 0.9611111111111111 | 0 |
| 0.9618055555555555 | 0 |
| 0.9625 | 0 |
| 0.9631944444444445 | 0 |
| 0.9638888888888889 | 0 |
| 0.9645833333333332 | 0 |
| 0.9652777777777778 | 0 |
| 0.9659722222222222 | 0 |
| 0.9666666666666667 | 0 |
| 0.967361111111111 | 0 |
| 0.9680555555555556 | 0 |
| 0.96875 | 0 |
| 0.9694444444444444 | 0 |
| 0.970138888888889 | 0 |
| 0.9708333333333333 | 0 |
| 0.9715277777777778 | 0 |
| 0.9722222222222222 | 0 |
| 0.9729166666666668 | 0 |
| 0.9736111111111111 | 0 |
| 0.9743055555555555 | 0 |
| 0.975 | 0 |
| 0.9756944444444445 | 0 |
| 0.9763888888888889 | 0 |
| 0.9770833333333333 | 0 |
| 0.9777777777777777 | 0 |
| 0.9784722222222223 | 0 |
| 0.9791666666666666 | 0 |
| 0.9798611111111111 | 0 |
| 0.9805555555555556 | 0 |
| 0.9812500000000001 | 0 |
| 0.9819444444444444 | 0 |
| 0.9826388888888888 | 0 |
| 0.9833333333333334 | 0 |
| 0.9840277777777778 | 0 |
| 0.9847222222222222 | 0 |
| 0.9854166666666666 | 0 |
| 0.9861111111111112 | 0 |
| 0.9868055555555556 | 0 |
| 0.9874999999999999 | 0 |
| 0.9881944444444444 | 0 |
| 0.9888888888888889 | 0 |
| 0.9895833333333334 | 0 |
| 0.9902777777777777 | 0 |
| 0.9909722222222223 | 0 |
| 0.9916666666666667 | 0 |
| 0.9923611111111111 | 0 |
| 0.9930555555555555 | 0 |
| 0.99375 | 0 |
| 0.9944444444444445 | 0 |
| 0.9951388888888889 | 0 |
| 0.9958333333333332 | 0 |
| 0.9965277777777778 | 0 |
| 0.9972222222222222 | 0 |
| 0.9979166666666667 | 0 |
| 0.998611111111111 | 0 |
| 0.9993055555555556 | 0 |